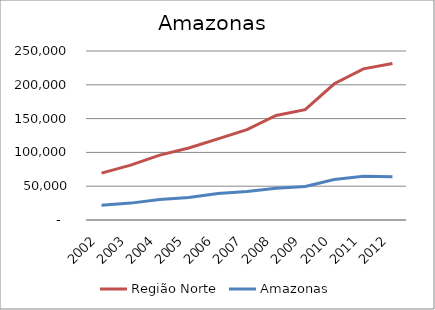
| Category | Região Norte | Amazonas |
|---|---|---|
| 2002.0 | 69309.957 | 21791.162 |
| 2003.0 | 81199.581 | 24977.17 |
| 2004.0 | 96012.341 | 30313.735 |
| 2005.0 | 106441.71 | 33352.137 |
| 2006.0 | 119993.429 | 39156.902 |
| 2007.0 | 133578.391 | 42023.218 |
| 2008.0 | 154703.433 | 46822.569 |
| 2009.0 | 163207.956 | 49614.251 |
| 2010.0 | 201510.748 | 59779.292 |
| 2011.0 | 223537.9 | 64555.404 |
| 2012.0 | 231383.089 | 64119.836 |